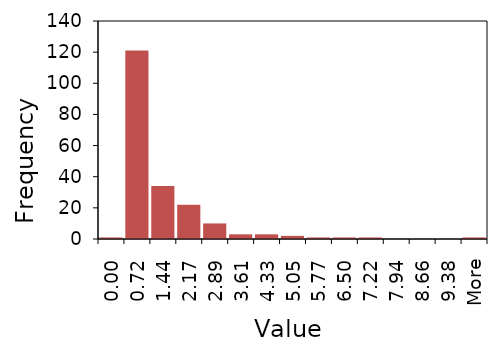
| Category | Series 1 |
|---|---|
| 0.00 | 1 |
| 0.72 | 121 |
| 1.44 | 34 |
| 2.17 | 22 |
| 2.89 | 10 |
| 3.61 | 3 |
| 4.33 | 3 |
| 5.05 | 2 |
| 5.77 | 1 |
| 6.50 | 1 |
| 7.22 | 1 |
| 7.94 | 0 |
| 8.66 | 0 |
| 9.38 | 0 |
| More | 1 |